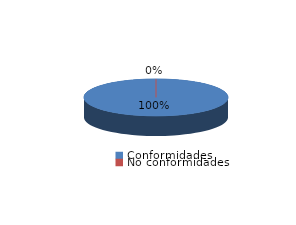
| Category | Series 0 |
|---|---|
| Conformidades | 227 |
| No conformidades | 0 |